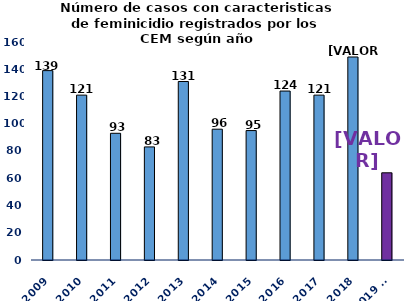
| Category | Feminicidio |
|---|---|
| 2009 | 139 |
| 2010 | 121 |
| 2011 | 93 |
| 2012 | 83 |
| 2013 | 131 |
| 2014 | 96 |
| 2015 | 95 |
| 2016 | 124 |
| 2017 | 121 |
| 2018 | 149 |
| 2019 a/ | 64 |